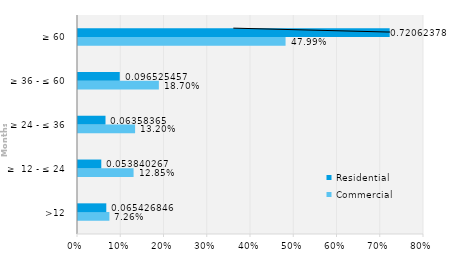
| Category | Commercial | Residential |
|---|---|---|
| >12 | 0.073 | 0.065 |
| ≥  12 - ≤ 24 | 0.128 | 0.054 |
| ≥ 24 - ≤ 36 | 0.132 | 0.064 |
| ≥ 36 - ≤ 60 | 0.187 | 0.097 |
| ≥ 60 | 0.48 | 0.721 |